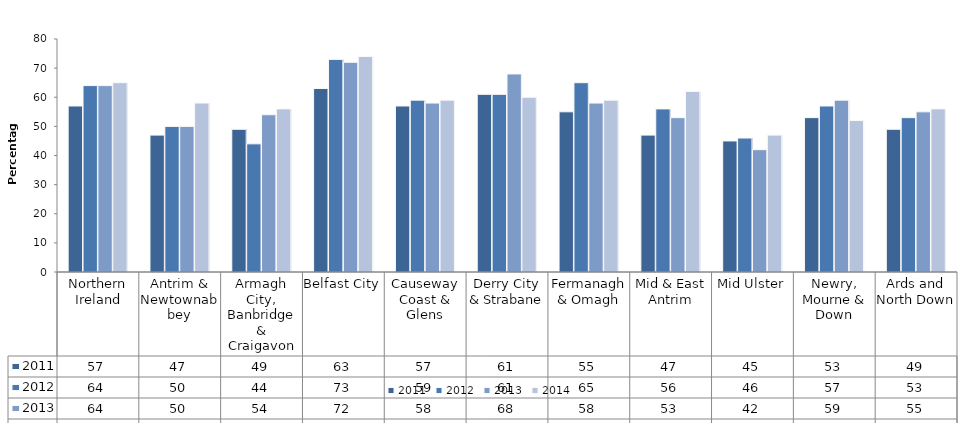
| Category | 2011 | 2012 | 2013 | 2014 |
|---|---|---|---|---|
| Northern Ireland | 57 | 64 | 64 | 65 |
| Antrim & Newtownabbey | 47 | 50 | 50 | 58 |
| Armagh City, Banbridge & Craigavon | 49 | 44 | 54 | 56 |
| Belfast City | 63 | 73 | 72 | 74 |
| Causeway Coast & Glens | 57 | 59 | 58 | 59 |
| Derry City & Strabane | 61 | 61 | 68 | 60 |
| Fermanagh & Omagh | 55 | 65 | 58 | 59 |
| Mid & East Antrim | 47 | 56 | 53 | 62 |
| Mid Ulster | 45 | 46 | 42 | 47 |
| Newry, Mourne & Down | 53 | 57 | 59 | 52 |
| Ards and North Down | 49 | 53 | 55 | 56 |